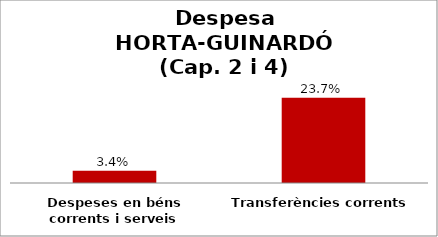
| Category | Series 0 |
|---|---|
| Despeses en béns corrents i serveis | 0.034 |
| Transferències corrents | 0.237 |